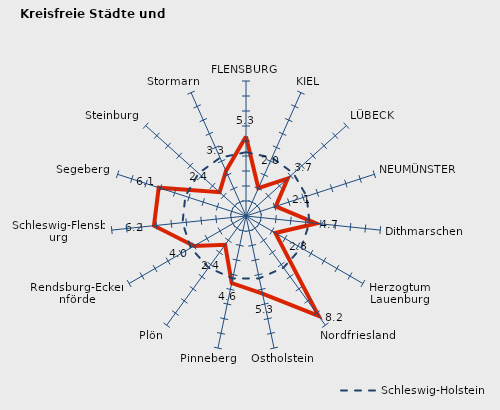
| Category | Kreise | Schleswig-Holstein |
|---|---|---|
| FLENSBURG | 5.301 | 4.253 |
| KIEL | 2.026 | 4.253 |
| LÜBECK | 3.741 | 4.253 |
| NEUMÜNSTER | 2.082 | 4.253 |
| Dithmarschen | 4.715 | 4.253 |
| Herzogtum Lauenburg | 2.257 | 4.253 |
| Nordfriesland | 8.231 | 4.253 |
| Ostholstein | 5.286 | 4.253 |
| Pinneberg | 4.571 | 4.253 |
| Plön | 2.37 | 4.253 |
| Rendsburg-Eckernförde | 3.991 | 4.253 |
| Schleswig-Flensburg | 6.169 | 4.253 |
| Segeberg | 6.119 | 4.253 |
| Steinburg | 2.366 | 4.253 |
| Stormarn | 3.289 | 4.253 |